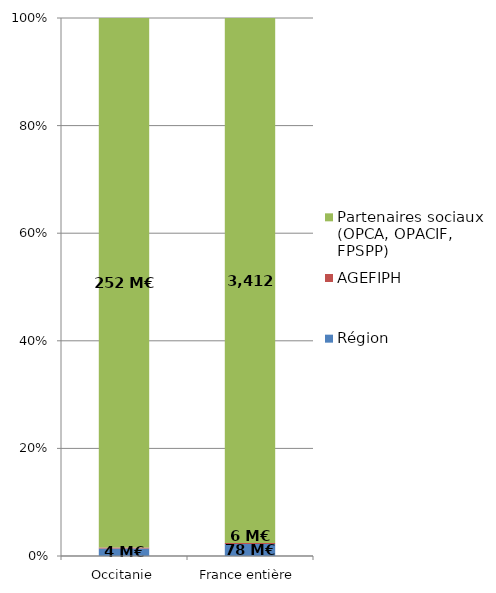
| Category | Région | AGEFIPH | Partenaires sociaux (OPCA, OPACIF, FPSPP) |
|---|---|---|---|
| Occitanie | 3.612 | 0.495 | 252.067 |
| France entière | 77.612 | 6.161 | 3411.683 |